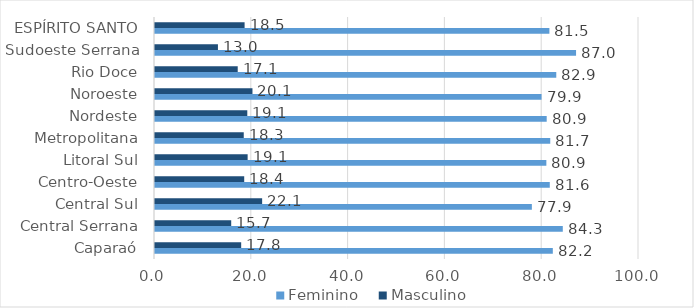
| Category | Feminino | Masculino  |
|---|---|---|
| Caparaó | 82.194 | 17.806 |
| Central Serrana | 84.255 | 15.745 |
| Central Sul | 77.863 | 22.137 |
| Centro-Oeste | 81.568 | 18.432 |
| Litoral Sul | 80.859 | 19.141 |
| Metropolitana | 81.663 | 18.337 |
| Nordeste | 80.93 | 19.07 |
| Noroeste | 79.862 | 20.138 |
| Rio Doce | 82.908 | 17.092 |
| Sudoeste Serrana | 86.996 | 13.004 |
| ESPÍRITO SANTO | 81.488 | 18.512 |